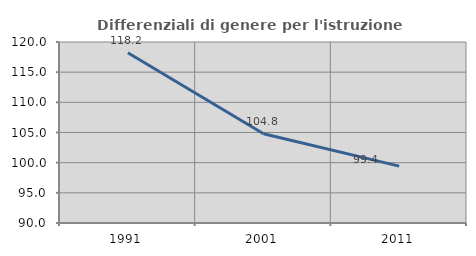
| Category | Differenziali di genere per l'istruzione superiore |
|---|---|
| 1991.0 | 118.216 |
| 2001.0 | 104.78 |
| 2011.0 | 99.422 |